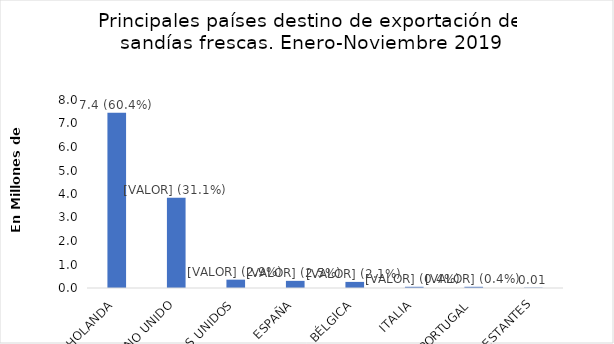
| Category | Series 0 |
|---|---|
| HOLANDA | 7456263 |
| REINO UNIDO | 3842136 |
| ESTADOS UNIDOS | 354672 |
| ESPAÑA | 304282 |
| BÉLGICA | 259517 |
| ITALIA | 51949 |
| PORTUGAL | 51544 |
| 2 PAISES RESTANTES | 14700 |